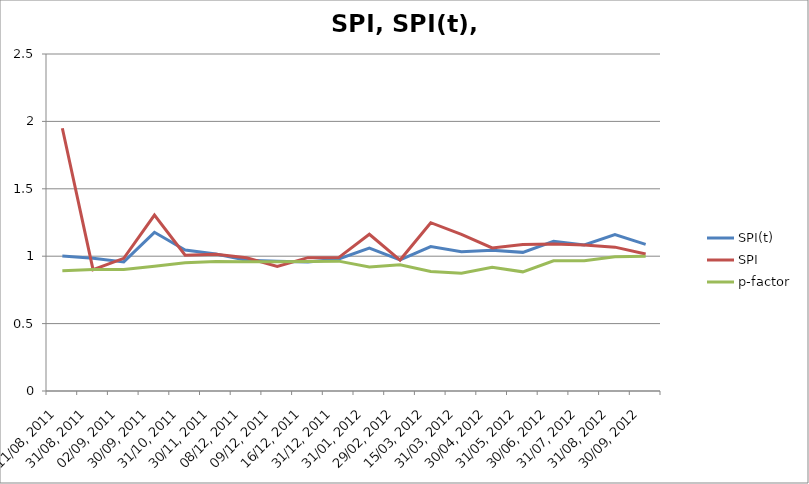
| Category | SPI(t) | SPI | p-factor |
|---|---|---|---|
| 11/08, 2011 | 1.002 | 1.949 | 0.892 |
| 31/08, 2011 | 0.986 | 0.9 | 0.9 |
| 02/09, 2011 | 0.958 | 0.984 | 0.9 |
| 30/09, 2011 | 1.177 | 1.305 | 0.926 |
| 31/10, 2011 | 1.046 | 1.007 | 0.951 |
| 30/11, 2011 | 1.017 | 1.015 | 0.961 |
| 08/12, 2011 | 0.97 | 0.988 | 0.959 |
| 09/12, 2011 | 0.963 | 0.924 | 0.959 |
| 16/12, 2011 | 0.957 | 0.989 | 0.961 |
| 31/12, 2011 | 0.979 | 0.99 | 0.963 |
| 31/01, 2012 | 1.061 | 1.163 | 0.919 |
| 29/02, 2012 | 0.973 | 0.972 | 0.937 |
| 15/03, 2012 | 1.071 | 1.249 | 0.887 |
| 31/03, 2012 | 1.034 | 1.163 | 0.873 |
| 30/04, 2012 | 1.044 | 1.061 | 0.918 |
| 31/05, 2012 | 1.028 | 1.087 | 0.884 |
| 30/06, 2012 | 1.111 | 1.09 | 0.966 |
| 31/07, 2012 | 1.083 | 1.083 | 0.966 |
| 31/08, 2012 | 1.16 | 1.067 | 0.996 |
| 30/09, 2012 | 1.088 | 1.016 | 1 |